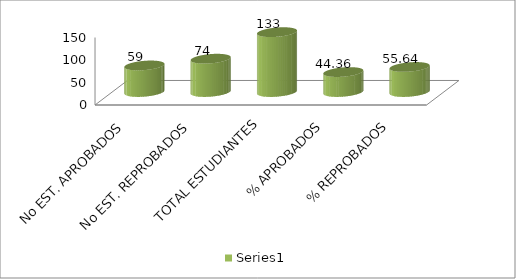
| Category | Series 0 |
|---|---|
| No EST. APROBADOS | 59 |
| No EST. REPROBADOS | 74 |
| TOTAL ESTUDIANTES | 133 |
| % APROBADOS | 44.361 |
| % REPROBADOS | 55.639 |